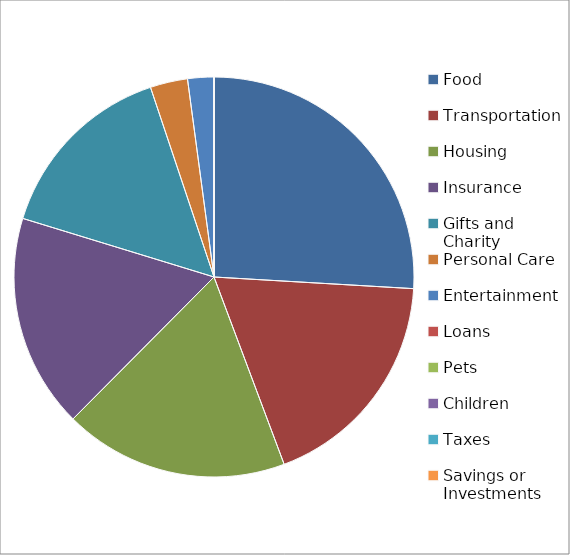
| Category | Series 2 |
|---|---|
| Food | 0.259 |
| Transportation | 0.184 |
| Housing | 0.182 |
| Insurance | 0.173 |
| Gifts and Charity | 0.151 |
| Personal Care | 0.03 |
| Entertainment | 0.021 |
| Loans | 0 |
| Pets | 0 |
| Children | 0 |
| Taxes | 0 |
| Savings or Investments | 0 |